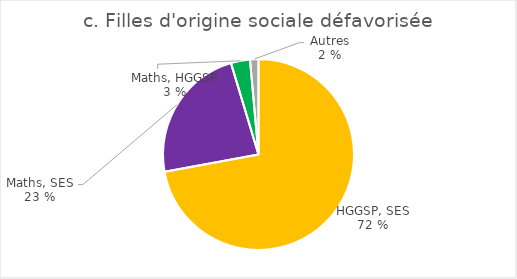
| Category | Filles d'origine sociale défavorisée |
|---|---|
| HGGSP, SES | 2227 |
| Mathématiques, SES | 718 |
| Mathématiques, HGGSP | 100 |
| Autres | 44 |